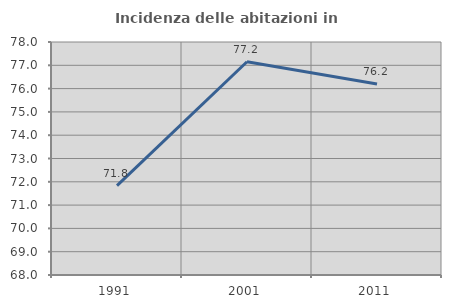
| Category | Incidenza delle abitazioni in proprietà  |
|---|---|
| 1991.0 | 71.839 |
| 2001.0 | 77.153 |
| 2011.0 | 76.196 |